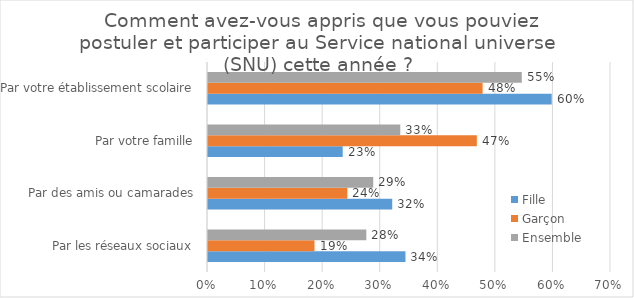
| Category | Fille | Garçon | Ensemble |
|---|---|---|---|
| Par les réseaux sociaux | 0.343 | 0.185 | 0.275 |
| Par des amis ou camarades | 0.32 | 0.242 | 0.287 |
| Par votre famille | 0.234 | 0.467 | 0.334 |
| Par votre établissement scolaire | 0.597 | 0.477 | 0.545 |